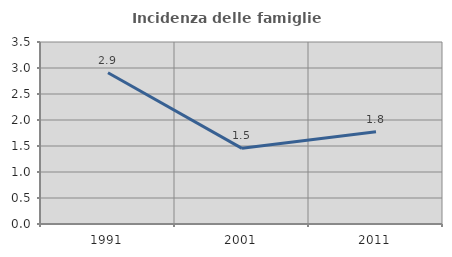
| Category | Incidenza delle famiglie numerose |
|---|---|
| 1991.0 | 2.909 |
| 2001.0 | 1.455 |
| 2011.0 | 1.775 |